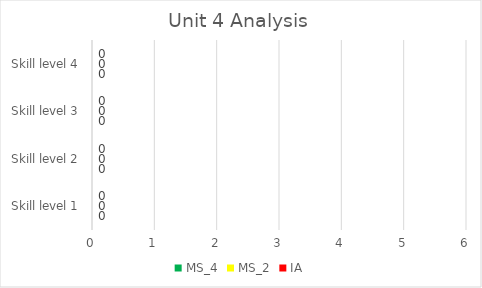
| Category | MS_4 | MS_2 | IA |
|---|---|---|---|
| Skill level 1 | 0 | 0 | 0 |
| Skill level 2 | 0 | 0 | 0 |
| Skill level 3 | 0 | 0 | 0 |
| Skill level 4 | 0 | 0 | 0 |